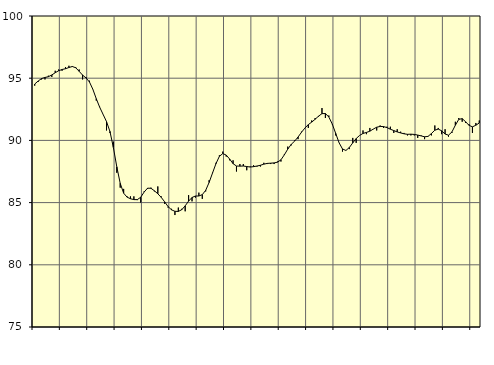
| Category | Piggar | Series 1 |
|---|---|---|
| nan | 94.4 | 94.53 |
| 87.0 | 94.7 | 94.77 |
| 87.0 | 94.9 | 94.97 |
| 87.0 | 94.9 | 95.06 |
| nan | 95.2 | 95.12 |
| 88.0 | 95.1 | 95.26 |
| 88.0 | 95.6 | 95.44 |
| 88.0 | 95.7 | 95.6 |
| nan | 95.6 | 95.7 |
| 89.0 | 95.9 | 95.76 |
| 89.0 | 96 | 95.86 |
| 89.0 | 95.9 | 95.94 |
| nan | 95.9 | 95.84 |
| 90.0 | 95.7 | 95.55 |
| 90.0 | 94.9 | 95.25 |
| 90.0 | 95.1 | 95.02 |
| nan | 94.8 | 94.7 |
| 91.0 | 94.1 | 94.11 |
| 91.0 | 93.2 | 93.35 |
| 91.0 | 92.7 | 92.67 |
| nan | 92.1 | 92.09 |
| 92.0 | 90.8 | 91.51 |
| 92.0 | 90.6 | 90.72 |
| 92.0 | 89.9 | 89.43 |
| nan | 87.4 | 87.88 |
| 93.0 | 86.2 | 86.55 |
| 93.0 | 86.1 | 85.76 |
| 93.0 | 85.5 | 85.44 |
| nan | 85.5 | 85.31 |
| 94.0 | 85.5 | 85.24 |
| 94.0 | 85.2 | 85.24 |
| 94.0 | 85 | 85.43 |
| nan | 85.9 | 85.85 |
| 95.0 | 86.1 | 86.16 |
| 95.0 | 86.2 | 86.15 |
| 95.0 | 85.9 | 85.95 |
| nan | 86.3 | 85.71 |
| 96.0 | 85.5 | 85.42 |
| 96.0 | 84.9 | 85.06 |
| 96.0 | 84.6 | 84.68 |
| nan | 84.5 | 84.42 |
| 97.0 | 84 | 84.3 |
| 97.0 | 84.6 | 84.29 |
| 97.0 | 84.5 | 84.43 |
| nan | 84.3 | 84.74 |
| 98.0 | 85.6 | 85.12 |
| 98.0 | 85.1 | 85.41 |
| 98.0 | 85.4 | 85.53 |
| nan | 85.8 | 85.53 |
| 99.0 | 85.3 | 85.64 |
| 99.0 | 85.9 | 85.99 |
| 99.0 | 86.8 | 86.62 |
| nan | 87.4 | 87.38 |
| 0.0 | 88.2 | 88.13 |
| 0.0 | 88.8 | 88.72 |
| 0.0 | 89.1 | 88.94 |
| nan | 88.7 | 88.82 |
| 1.0 | 88.4 | 88.5 |
| 1.0 | 88.4 | 88.13 |
| 1.0 | 87.5 | 87.94 |
| nan | 88.1 | 87.93 |
| 2.0 | 88.1 | 87.94 |
| 2.0 | 87.6 | 87.9 |
| 2.0 | 87.9 | 87.86 |
| nan | 88 | 87.89 |
| 3.0 | 87.9 | 87.94 |
| 3.0 | 87.9 | 88 |
| 3.0 | 88.2 | 88.09 |
| nan | 88.1 | 88.15 |
| 4.0 | 88.1 | 88.17 |
| 4.0 | 88.1 | 88.19 |
| 4.0 | 88.3 | 88.25 |
| nan | 88.3 | 88.44 |
| 5.0 | 88.9 | 88.84 |
| 5.0 | 89.5 | 89.3 |
| 5.0 | 89.6 | 89.68 |
| nan | 90 | 89.94 |
| 6.0 | 90.1 | 90.27 |
| 6.0 | 90.7 | 90.65 |
| 6.0 | 91 | 90.99 |
| nan | 91 | 91.27 |
| 7.0 | 91.6 | 91.47 |
| 7.0 | 91.8 | 91.7 |
| 7.0 | 91.9 | 91.95 |
| nan | 92.6 | 92.15 |
| 8.0 | 91.8 | 92.16 |
| 8.0 | 92 | 91.88 |
| 8.0 | 91.3 | 91.32 |
| nan | 90.4 | 90.57 |
| 9.0 | 89.8 | 89.81 |
| 9.0 | 89.1 | 89.31 |
| 9.0 | 89.2 | 89.19 |
| nan | 89.3 | 89.43 |
| 10.0 | 90.2 | 89.8 |
| 10.0 | 89.8 | 90.15 |
| 10.0 | 90.4 | 90.4 |
| nan | 90.8 | 90.56 |
| 11.0 | 90.5 | 90.64 |
| 11.0 | 91 | 90.74 |
| 11.0 | 90.9 | 90.91 |
| nan | 90.8 | 91.06 |
| 12.0 | 91.2 | 91.12 |
| 12.0 | 91 | 91.11 |
| 12.0 | 91.1 | 91.03 |
| nan | 91.1 | 90.9 |
| 13.0 | 90.6 | 90.79 |
| 13.0 | 90.9 | 90.68 |
| 13.0 | 90.7 | 90.6 |
| nan | 90.6 | 90.53 |
| 14.0 | 90.4 | 90.49 |
| 14.0 | 90.4 | 90.5 |
| 14.0 | 90.4 | 90.48 |
| nan | 90.2 | 90.43 |
| 15.0 | 90.4 | 90.36 |
| 15.0 | 90.1 | 90.29 |
| 15.0 | 90.3 | 90.32 |
| nan | 90.4 | 90.55 |
| 16.0 | 91.2 | 90.82 |
| 16.0 | 91 | 90.91 |
| 16.0 | 90.5 | 90.77 |
| nan | 90.9 | 90.51 |
| 17.0 | 90.3 | 90.42 |
| 17.0 | 90.6 | 90.68 |
| 17.0 | 91.5 | 91.22 |
| nan | 91.8 | 91.69 |
| 18.0 | 91.5 | 91.75 |
| 18.0 | 91.4 | 91.5 |
| 18.0 | 91.3 | 91.21 |
| nan | 90.6 | 91.09 |
| 19.0 | 91.4 | 91.22 |
| 19.0 | 91.6 | 91.4 |